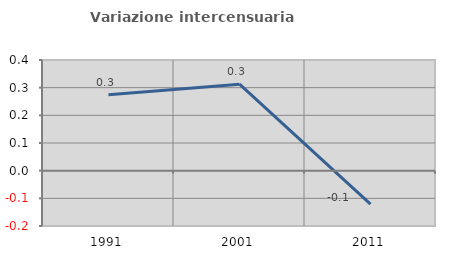
| Category | Variazione intercensuaria annua |
|---|---|
| 1991.0 | 0.274 |
| 2001.0 | 0.313 |
| 2011.0 | -0.121 |